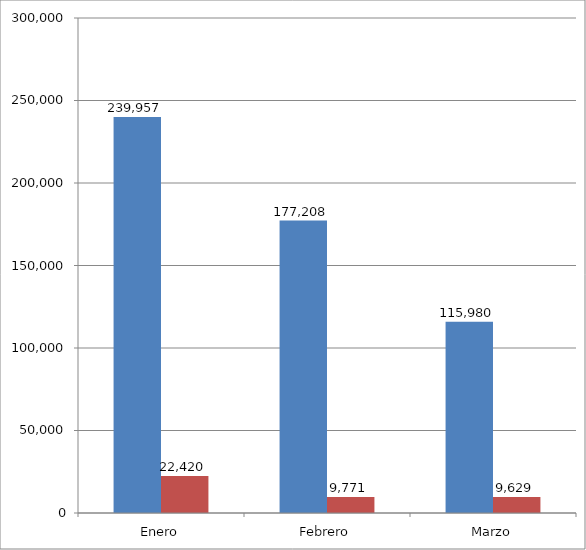
| Category | Series 0 | Series 1 |
|---|---|---|
| Enero | 239957 | 22420 |
| Febrero | 177208 | 9771 |
| Marzo | 115980 | 9629 |